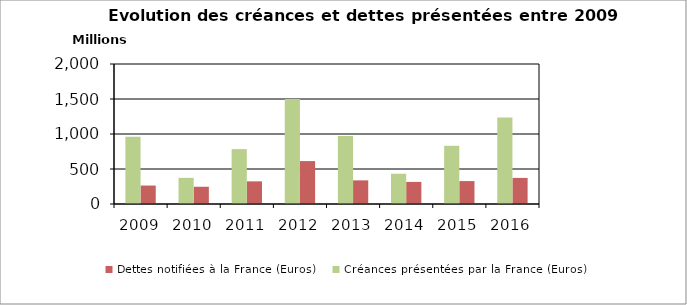
| Category | Dettes notifiées à la France (Euros) | Créances présentées par la France (Euros) |
|---|---|---|
| 2016.0 | 372614397.653 | 1236085966.45 |
| 2015.0 | 327455831.825 | 831670713.13 |
| 2014.0 | 315549521.753 | 432336527.46 |
| 2013.0 | 337787874.168 | 971282809.93 |
| 2012.0 | 613260404.07 | 1499361616.86 |
| 2011.0 | 323738859.74 | 784274116.36 |
| 2010.0 | 246249530.44 | 373736246.09 |
| 2009.0 | 263670697.87 | 961736592.91 |